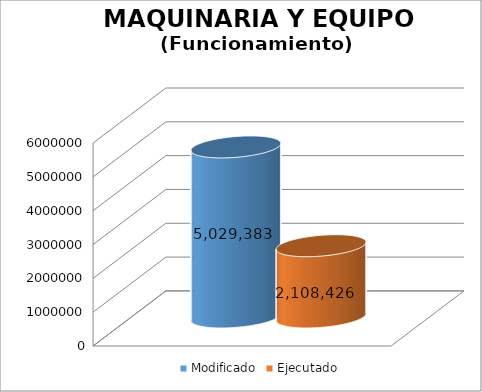
| Category | Modificado | Ejecutado |
|---|---|---|
| 0 | 5029383 | 2108425.85 |